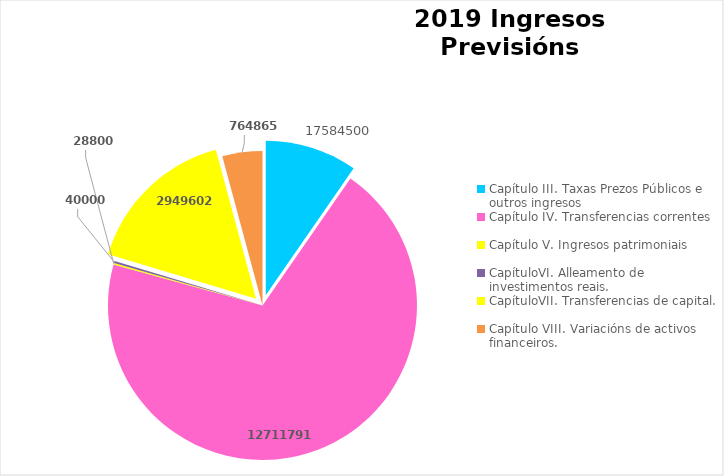
| Category | Series 0 |
|---|---|
| Capítulo III. Taxas Prezos Públicos e outros ingresos  | 17584500 |
| Capítulo IV. Transferencias correntes | 127117911 |
| Capítulo V. Ingresos patrimoniais | 288000 |
| CapítuloVI. Alleamento de investimentos reais. | 400000 |
| CapítuloVII. Transferencias de capital. | 29496028 |
| Capítulo VIII. Variacións de activos financeiros. | 7648650 |